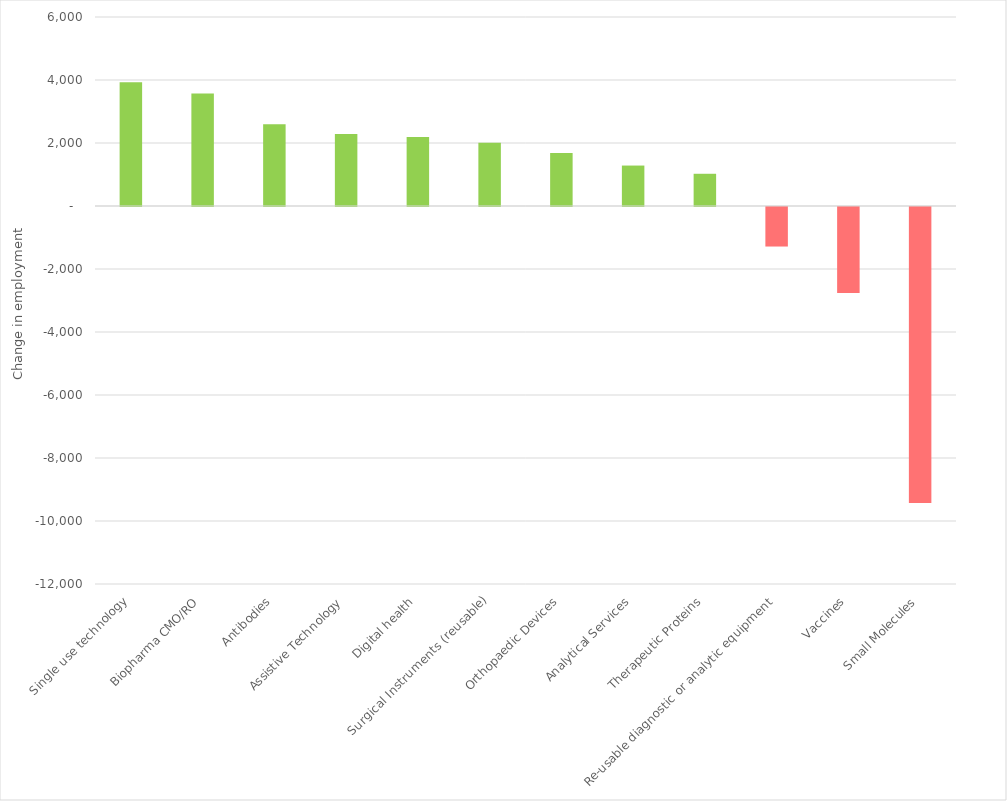
| Category | Change in employment 2009 to 2017 |
|---|---|
| Single use technology | 3927 |
| Biopharma CMO/RO | 3572 |
| Antibodies | 2592 |
| Assistive Technology | 2284 |
| Digital health | 2189 |
| Surgical Instruments (reusable) | 2010 |
| Orthopaedic Devices | 1681 |
| Analytical Services | 1284 |
| Therapeutic Proteins | 1023 |
| Re-usable diagnostic or analytic equipment | -1255 |
| Vaccines | -2729 |
| Small Molecules | -9400 |